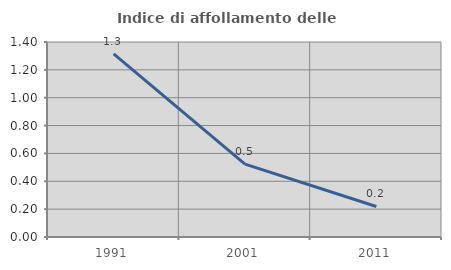
| Category | Indice di affollamento delle abitazioni  |
|---|---|
| 1991.0 | 1.315 |
| 2001.0 | 0.523 |
| 2011.0 | 0.219 |